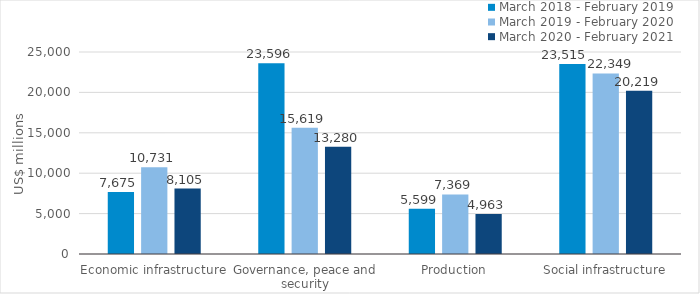
| Category | March 2018 - February 2019 | March 2019 - February 2020 | March 2020 - February 2021 |
|---|---|---|---|
| Economic infrastructure | 7675.391 | 10731.238 | 8104.777 |
| Governance, peace and security | 23595.55 | 15618.77 | 13280.065 |
| Production | 5599.228 | 7369.487 | 4962.621 |
| Social infrastructure | 23514.795 | 22348.826 | 20218.841 |